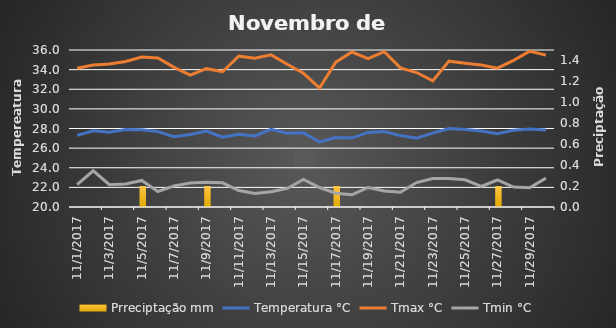
| Category | Prreciptação |
|---|---|
| 0 | 0 |
| 1/1/00 | 0 |
| 1/2/00 | 0 |
| 1/3/00 | 0 |
| 1/4/00 | 0.2 |
| 1/5/00 | 0 |
| 1/6/00 | 0 |
| 1/7/00 | 0 |
| 1/8/00 | 0.2 |
| 1/9/00 | 0 |
| 1/10/00 | 0 |
| 1/11/00 | 0 |
| 1/12/00 | 0 |
| 1/13/00 | 0 |
| 1/14/00 | 0 |
| 1/15/00 | 0 |
| 1/16/00 | 0.2 |
| 1/17/00 | 0 |
| 1/18/00 | 0 |
| 1/19/00 | 0 |
| 1/20/00 | 0 |
| 1/21/00 | 0 |
| 1/22/00 | 0 |
| 1/23/00 | 0 |
| 1/24/00 | 0 |
| 1/25/00 | 0 |
| 1/26/00 | 0.2 |
| 1/27/00 | 0 |
| 1/28/00 | 0 |
| 1/29/00 | 0 |